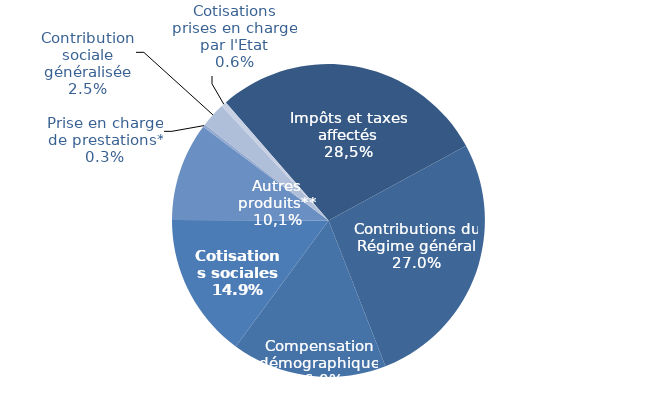
| Category | Series 0 |
|---|---|
| ITAF | 0.285 |
| Contributions du Régime général | 0.27 |
| Compensation démographique | 0.16 |
| Cotisations sociales | 0.149 |
| Autres produits** | 0.102 |
| Prise en charge de prestations* | 0.003 |
| Contribution sociale généralisée | 0.025 |
| Cotisations prises en charge par l'Etat | 0.006 |